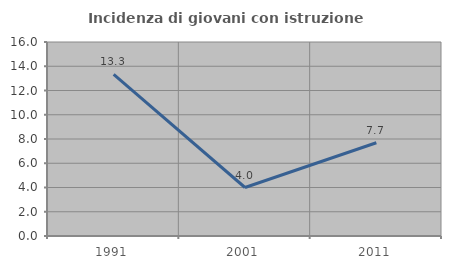
| Category | Incidenza di giovani con istruzione universitaria |
|---|---|
| 1991.0 | 13.333 |
| 2001.0 | 4 |
| 2011.0 | 7.692 |